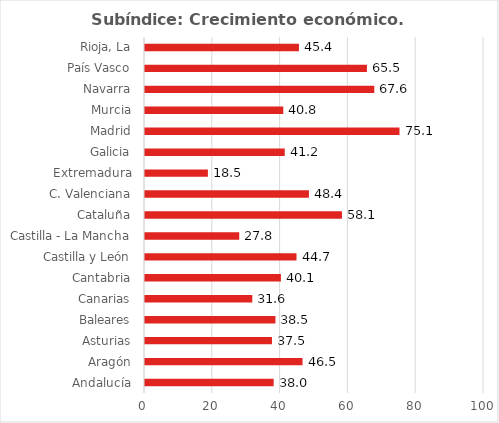
| Category | Subíndice: Crecimiento económico |
|---|---|
| Andalucía | 37.956 |
| Aragón | 46.468 |
| Asturias | 37.452 |
| Baleares | 38.478 |
| Canarias | 31.649 |
| Cantabria | 40.094 |
| Castilla y León | 44.69 |
| Castilla - La Mancha | 27.802 |
| Cataluña | 58.106 |
| C. Valenciana | 48.356 |
| Extremadura | 18.55 |
| Galicia | 41.214 |
| Madrid | 75.075 |
| Murcia | 40.785 |
| Navarra | 67.632 |
| País Vasco | 65.465 |
| Rioja, La | 45.414 |